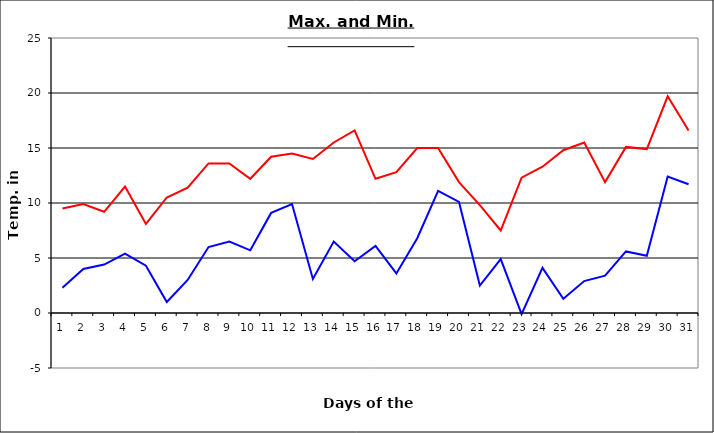
| Category | Series 0 | Series 1 |
|---|---|---|
| 0 | 9.5 | 2.3 |
| 1 | 9.9 | 4 |
| 2 | 9.2 | 4.4 |
| 3 | 11.5 | 5.4 |
| 4 | 8.1 | 4.3 |
| 5 | 10.5 | 1 |
| 6 | 11.4 | 3 |
| 7 | 13.6 | 6 |
| 8 | 13.6 | 6.5 |
| 9 | 12.2 | 5.7 |
| 10 | 14.2 | 9.1 |
| 11 | 14.5 | 9.9 |
| 12 | 14 | 3.1 |
| 13 | 15.5 | 6.5 |
| 14 | 16.6 | 4.7 |
| 15 | 12.2 | 6.1 |
| 16 | 12.8 | 3.6 |
| 17 | 15 | 6.8 |
| 18 | 15 | 11.1 |
| 19 | 11.9 | 10.1 |
| 20 | 9.8 | 2.5 |
| 21 | 7.5 | 4.9 |
| 22 | 12.3 | -0.1 |
| 23 | 13.3 | 4.1 |
| 24 | 14.8 | 1.3 |
| 25 | 15.5 | 2.9 |
| 26 | 11.9 | 3.4 |
| 27 | 15.1 | 5.6 |
| 28 | 14.9 | 5.2 |
| 29 | 19.7 | 12.4 |
| 30 | 16.6 | 11.7 |